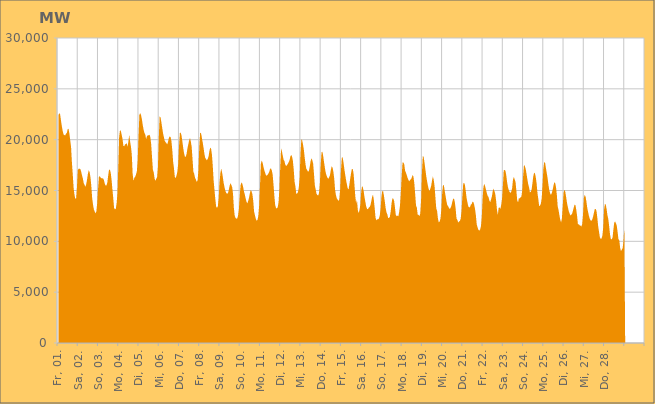
| Category | Series 0 |
|---|---|
|  Fr, 01.  | 22399.033 |
|  Fr, 01.  | 22611.468 |
|  Fr, 01.  | 22499.034 |
|  Fr, 01.  | 21905.06 |
|  Fr, 01.  | 21350.365 |
|  Fr, 01.  | 20880.815 |
|  Fr, 01.  | 20531.171 |
|  Fr, 01.  | 20449.737 |
|  Fr, 01.  | 20410.461 |
|  Fr, 01.  | 20598.987 |
|  Fr, 01.  | 20659.702 |
|  Fr, 01.  | 21032.747 |
|  Fr, 01.  | 21080.836 |
|  Fr, 01.  | 20594.231 |
|  Fr, 01.  | 19942.812 |
|  Fr, 01.  | 19267.961 |
|  Fr, 01.  | 17762.881 |
|  Sa, 02.  | 16591.793 |
|  Sa, 02.  | 15282.178 |
|  Sa, 02.  | 14602.927 |
|  Sa, 02.  | 14180.129 |
|  Sa, 02.  | 14240.453 |
|  Sa, 02.  | 15360.517 |
|  Sa, 02.  | 17010.069 |
|  Sa, 02.  | 17146.067 |
|  Sa, 02.  | 17145.606 |
|  Sa, 02.  | 17114.388 |
|  Sa, 02.  | 16852.625 |
|  Sa, 02.  | 16471.825 |
|  Sa, 02.  | 16177.356 |
|  Sa, 02.  | 15717.177 |
|  Sa, 02.  | 15541.882 |
|  Sa, 02.  | 15359.873 |
|  Sa, 02.  | 15633.692 |
|  Sa, 02.  | 16109.346 |
|  Sa, 02.  | 16650.852 |
|  Sa, 02.  | 17016.553 |
|  Sa, 02.  | 16788.437 |
|  Sa, 02.  | 16309.497 |
|  Sa, 02.  | 15439.524 |
|  Sa, 02.  | 14265.198 |
|  So, 03.  | 13619.63 |
|  So, 03.  | 13150.792 |
|  So, 03.  | 12941.03 |
|  So, 03.  | 12738.193 |
|  So, 03.  | 12961.352 |
|  So, 03.  | 13761.083 |
|  So, 03.  | 15184.934 |
|  So, 03.  | 16328.466 |
|  So, 03.  | 16411.588 |
|  So, 03.  | 16270.473 |
|  So, 03.  | 16199.948 |
|  So, 03.  | 16204.764 |
|  So, 03.  | 16174.838 |
|  So, 03.  | 16008.456 |
|  So, 03.  | 15653.758 |
|  So, 03.  | 15478.343 |
|  So, 03.  | 15504.72 |
|  So, 03.  | 15784.847 |
|  So, 03.  | 16467.389 |
|  So, 03.  | 17032.15 |
|  So, 03.  | 17055.03 |
|  So, 03.  | 16749.838 |
|  So, 03.  | 16054.379 |
|  So, 03.  | 15127.17 |
|  Mo, 04.  | 14258.505 |
|  Mo, 04.  | 13283.716 |
|  Mo, 04.  | 13149.603 |
|  Mo, 04.  | 13186.794 |
|  Mo, 04.  | 13750.439 |
|  Mo, 04.  | 14725.62 |
|  Mo, 04.  | 17343.273 |
|  Mo, 04.  | 20276.248 |
|  Mo, 04.  | 20950.206 |
|  Mo, 04.  | 20842.98 |
|  Mo, 04.  | 20491.643 |
|  Mo, 04.  | 20062.44 |
|  Mo, 04.  | 19406.599 |
|  Mo, 04.  | 19343.089 |
|  Mo, 04.  | 19536.249 |
|  Mo, 04.  | 19569.945 |
|  Mo, 04.  | 19655.745 |
|  Mo, 04.  | 19298.304 |
|  Mo, 04.  | 19854.97 |
|  Mo, 04.  | 20486.493 |
|  Mo, 04.  | 19820.566 |
|  Mo, 04.  | 19313.971 |
|  Mo, 04.  | 18539.929 |
|  Mo, 04.  | 16651.296 |
|  Di, 05.  | 15953.222 |
|  Di, 05.  | 16244.926 |
|  Di, 05.  | 16362.413 |
|  Di, 05.  | 16569.384 |
|  Di, 05.  | 16893.118 |
|  Di, 05.  | 17979.938 |
|  Di, 05.  | 20383.844 |
|  Di, 05.  | 22461.601 |
|  Di, 05.  | 22612.34 |
|  Di, 05.  | 22414.642 |
|  Di, 05.  | 21999.145 |
|  Di, 05.  | 21430.655 |
|  Di, 05.  | 20979.548 |
|  Di, 05.  | 20656.635 |
|  Di, 05.  | 20499.665 |
|  Di, 05.  | 20056.514 |
|  Di, 05.  | 20351.01 |
|  Di, 05.  | 20426.241 |
|  Di, 05.  | 20432.862 |
|  Di, 05.  | 20482.469 |
|  Di, 05.  | 20235.993 |
|  Di, 05.  | 19537.118 |
|  Di, 05.  | 18291.538 |
|  Di, 05.  | 17055.744 |
|  Mi, 06.  | 16792.421 |
|  Mi, 06.  | 16179.504 |
|  Mi, 06.  | 15961.496 |
|  Mi, 06.  | 16153.151 |
|  Mi, 06.  | 16313.219 |
|  Mi, 06.  | 17326.554 |
|  Mi, 06.  | 20161.857 |
|  Mi, 06.  | 22275.907 |
|  Mi, 06.  | 22211.357 |
|  Mi, 06.  | 21757.093 |
|  Mi, 06.  | 21194.512 |
|  Mi, 06.  | 20646.053 |
|  Mi, 06.  | 20268.349 |
|  Mi, 06.  | 19898.55 |
|  Mi, 06.  | 19765.44 |
|  Mi, 06.  | 19663.982 |
|  Mi, 06.  | 19532.734 |
|  Mi, 06.  | 19815.987 |
|  Mi, 06.  | 20168.375 |
|  Mi, 06.  | 20333.433 |
|  Mi, 06.  | 20244.9 |
|  Mi, 06.  | 19859.774 |
|  Mi, 06.  | 18981.743 |
|  Mi, 06.  | 17831.027 |
|  Do, 07.  | 17191.225 |
|  Do, 07.  | 16330.566 |
|  Do, 07.  | 16227.694 |
|  Do, 07.  | 16451.338 |
|  Do, 07.  | 16840.939 |
|  Do, 07.  | 17599.948 |
|  Do, 07.  | 19354.517 |
|  Do, 07.  | 20649.995 |
|  Do, 07.  | 20697.506 |
|  Do, 07.  | 20392.975 |
|  Do, 07.  | 19797.814 |
|  Do, 07.  | 19164.957 |
|  Do, 07.  | 18644.991 |
|  Do, 07.  | 18321.438 |
|  Do, 07.  | 18330.375 |
|  Do, 07.  | 18618.355 |
|  Do, 07.  | 19147.468 |
|  Do, 07.  | 19543.625 |
|  Do, 07.  | 19931.198 |
|  Do, 07.  | 20179.908 |
|  Do, 07.  | 19815.661 |
|  Do, 07.  | 19288.28 |
|  Do, 07.  | 18088.615 |
|  Do, 07.  | 16871.67 |
|  Fr, 08.  | 16636.873 |
|  Fr, 08.  | 16254.698 |
|  Fr, 08.  | 16081.576 |
|  Fr, 08.  | 15845.416 |
|  Fr, 08.  | 16002.348 |
|  Fr, 08.  | 16962.045 |
|  Fr, 08.  | 19265.03 |
|  Fr, 08.  | 20634.935 |
|  Fr, 08.  | 20684.635 |
|  Fr, 08.  | 20233.171 |
|  Fr, 08.  | 19754.713 |
|  Fr, 08.  | 19245.2 |
|  Fr, 08.  | 18655.688 |
|  Fr, 08.  | 18224.634 |
|  Fr, 08.  | 18100.752 |
|  Fr, 08.  | 17973.731 |
|  Fr, 08.  | 18101.147 |
|  Fr, 08.  | 18350.485 |
|  Fr, 08.  | 18855.693 |
|  Fr, 08.  | 19238.471 |
|  Fr, 08.  | 19107.907 |
|  Fr, 08.  | 18539.623 |
|  Fr, 08.  | 17432.048 |
|  Fr, 08.  | 16002.932 |
|  Sa, 09.  | 15103.201 |
|  Sa, 09.  | 14180.098 |
|  Sa, 09.  | 13430.811 |
|  Sa, 09.  | 13297.46 |
|  Sa, 09.  | 13427.414 |
|  Sa, 09.  | 14233.636 |
|  Sa, 09.  | 15756.756 |
|  Sa, 09.  | 16681.082 |
|  Sa, 09.  | 17154.191 |
|  Sa, 09.  | 16805.19 |
|  Sa, 09.  | 16286.008 |
|  Sa, 09.  | 15705.692 |
|  Sa, 09.  | 15295.655 |
|  Sa, 09.  | 14956.647 |
|  Sa, 09.  | 14748.364 |
|  Sa, 09.  | 14700.133 |
|  Sa, 09.  | 14724.355 |
|  Sa, 09.  | 15050.512 |
|  Sa, 09.  | 15467.404 |
|  Sa, 09.  | 15732.505 |
|  Sa, 09.  | 15544.861 |
|  Sa, 09.  | 15329.564 |
|  Sa, 09.  | 14678.593 |
|  Sa, 09.  | 13321.978 |
|  So, 10.  | 12524.441 |
|  So, 10.  | 12297.619 |
|  So, 10.  | 12230.577 |
|  So, 10.  | 12249.294 |
|  So, 10.  | 12534.814 |
|  So, 10.  | 13184.216 |
|  So, 10.  | 14478.22 |
|  So, 10.  | 15518.754 |
|  So, 10.  | 15795.964 |
|  So, 10.  | 15689.548 |
|  So, 10.  | 15344.816 |
|  So, 10.  | 14910.797 |
|  So, 10.  | 14609.558 |
|  So, 10.  | 14219.632 |
|  So, 10.  | 13900.812 |
|  So, 10.  | 13742.199 |
|  So, 10.  | 13981.119 |
|  So, 10.  | 14286.604 |
|  So, 10.  | 14737.929 |
|  So, 10.  | 15054.3 |
|  So, 10.  | 14913.634 |
|  So, 10.  | 14630.492 |
|  So, 10.  | 13976.463 |
|  So, 10.  | 12925.016 |
|  Mo, 11.  | 12576.991 |
|  Mo, 11.  | 12227.617 |
|  Mo, 11.  | 12035.677 |
|  Mo, 11.  | 12094.645 |
|  Mo, 11.  | 12499.144 |
|  Mo, 11.  | 13495 |
|  Mo, 11.  | 15448.89 |
|  Mo, 11.  | 17600.108 |
|  Mo, 11.  | 17959.628 |
|  Mo, 11.  | 17763.802 |
|  Mo, 11.  | 17377.396 |
|  Mo, 11.  | 17027.411 |
|  Mo, 11.  | 16759.957 |
|  Mo, 11.  | 16508.8 |
|  Mo, 11.  | 16448.991 |
|  Mo, 11.  | 16544.359 |
|  Mo, 11.  | 16667.694 |
|  Mo, 11.  | 16855.202 |
|  Mo, 11.  | 17139.374 |
|  Mo, 11.  | 17173.098 |
|  Mo, 11.  | 16973.675 |
|  Mo, 11.  | 16562.666 |
|  Mo, 11.  | 15592.967 |
|  Mo, 11.  | 14498.882 |
|  Di, 12.  | 13572.429 |
|  Di, 12.  | 13282.461 |
|  Di, 12.  | 13239.428 |
|  Di, 12.  | 13357.963 |
|  Di, 12.  | 13835.487 |
|  Di, 12.  | 15138.762 |
|  Di, 12.  | 17287.342 |
|  Di, 12.  | 19119.529 |
|  Di, 12.  | 18859.788 |
|  Di, 12.  | 18428.559 |
|  Di, 12.  | 18030.147 |
|  Di, 12.  | 17889.529 |
|  Di, 12.  | 17537.995 |
|  Di, 12.  | 17416.34 |
|  Di, 12.  | 17505.82 |
|  Di, 12.  | 17608.35 |
|  Di, 12.  | 17785.064 |
|  Di, 12.  | 17967.405 |
|  Di, 12.  | 18343.216 |
|  Di, 12.  | 18508.334 |
|  Di, 12.  | 18328.639 |
|  Di, 12.  | 17911.296 |
|  Di, 12.  | 17063.084 |
|  Di, 12.  | 15857.447 |
|  Mi, 13.  | 15405.021 |
|  Mi, 13.  | 14655.684 |
|  Mi, 13.  | 14708.738 |
|  Mi, 13.  | 14837.816 |
|  Mi, 13.  | 15286.68 |
|  Mi, 13.  | 16259.924 |
|  Mi, 13.  | 18562.607 |
|  Mi, 13.  | 20036.119 |
|  Mi, 13.  | 19933.593 |
|  Mi, 13.  | 19533.41 |
|  Mi, 13.  | 19015.432 |
|  Mi, 13.  | 18240.002 |
|  Mi, 13.  | 17565.868 |
|  Mi, 13.  | 17111.695 |
|  Mi, 13.  | 17013.479 |
|  Mi, 13.  | 16827.296 |
|  Mi, 13.  | 16944.466 |
|  Mi, 13.  | 17354.711 |
|  Mi, 13.  | 17878.038 |
|  Mi, 13.  | 18173.385 |
|  Mi, 13.  | 17988.528 |
|  Mi, 13.  | 17657.829 |
|  Mi, 13.  | 16668.285 |
|  Mi, 13.  | 15528.695 |
|  Do, 14.  | 15103.697 |
|  Do, 14.  | 14680.396 |
|  Do, 14.  | 14559.282 |
|  Do, 14.  | 14500.68 |
|  Do, 14.  | 14762.674 |
|  Do, 14.  | 15696.729 |
|  Do, 14.  | 17560.401 |
|  Do, 14.  | 18764.67 |
|  Do, 14.  | 18808.024 |
|  Do, 14.  | 18354.768 |
|  Do, 14.  | 17759.494 |
|  Do, 14.  | 17215.028 |
|  Do, 14.  | 16723.225 |
|  Do, 14.  | 16458.274 |
|  Do, 14.  | 16246.165 |
|  Do, 14.  | 16153.225 |
|  Do, 14.  | 16310.376 |
|  Do, 14.  | 16508.744 |
|  Do, 14.  | 17023.921 |
|  Do, 14.  | 17387.684 |
|  Do, 14.  | 17266.799 |
|  Do, 14.  | 16848.157 |
|  Do, 14.  | 16191.939 |
|  Do, 14.  | 15109.325 |
|  Fr, 15.  | 14562.921 |
|  Fr, 15.  | 14238.613 |
|  Fr, 15.  | 14110.015 |
|  Fr, 15.  | 13976.249 |
|  Fr, 15.  | 14108.073 |
|  Fr, 15.  | 15052.126 |
|  Fr, 15.  | 16962.816 |
|  Fr, 15.  | 18206.259 |
|  Fr, 15.  | 18278.86 |
|  Fr, 15.  | 17754.449 |
|  Fr, 15.  | 17129.771 |
|  Fr, 15.  | 16561.506 |
|  Fr, 15.  | 16060.03 |
|  Fr, 15.  | 15610.241 |
|  Fr, 15.  | 15210.153 |
|  Fr, 15.  | 15093.719 |
|  Fr, 15.  | 15587.864 |
|  Fr, 15.  | 16177.893 |
|  Fr, 15.  | 16716.471 |
|  Fr, 15.  | 17129.37 |
|  Fr, 15.  | 17116.767 |
|  Fr, 15.  | 16636.842 |
|  Fr, 15.  | 15562.591 |
|  Fr, 15.  | 14436.874 |
|  Sa, 16.  | 13739.745 |
|  Sa, 16.  | 14070.666 |
|  Sa, 16.  | 13075.669 |
|  Sa, 16.  | 12780.313 |
|  Sa, 16.  | 13072.887 |
|  Sa, 16.  | 13611.801 |
|  Sa, 16.  | 14848.12 |
|  Sa, 16.  | 15442.54 |
|  Sa, 16.  | 15296.657 |
|  Sa, 16.  | 14897.964 |
|  Sa, 16.  | 14307.269 |
|  Sa, 16.  | 13849.555 |
|  Sa, 16.  | 13399.665 |
|  Sa, 16.  | 13192.145 |
|  Sa, 16.  | 13157.491 |
|  Sa, 16.  | 13321.984 |
|  Sa, 16.  | 13367.924 |
|  Sa, 16.  | 13560.573 |
|  Sa, 16.  | 13962.682 |
|  Sa, 16.  | 14384.035 |
|  Sa, 16.  | 14598.73 |
|  Sa, 16.  | 14062.078 |
|  Sa, 16.  | 13253.593 |
|  Sa, 16.  | 12321.545 |
|  So, 17.  | 12070.553 |
|  So, 17.  | 12166.711 |
|  So, 17.  | 12174.56 |
|  So, 17.  | 12248.57 |
|  So, 17.  | 12523.326 |
|  So, 17.  | 13196.857 |
|  So, 17.  | 14385.816 |
|  So, 17.  | 14949.981 |
|  So, 17.  | 14928.938 |
|  So, 17.  | 14476.055 |
|  So, 17.  | 13907.059 |
|  So, 17.  | 13251.584 |
|  So, 17.  | 12851.422 |
|  So, 17.  | 12643.209 |
|  So, 17.  | 12291.355 |
|  So, 17.  | 12306.989 |
|  So, 17.  | 12419.453 |
|  So, 17.  | 12945.315 |
|  So, 17.  | 13744.675 |
|  So, 17.  | 14232.367 |
|  So, 17.  | 14199.189 |
|  So, 17.  | 13996.815 |
|  So, 17.  | 13358.565 |
|  So, 17.  | 12612.033 |
|  Mo, 18.  | 12473.069 |
|  Mo, 18.  | 12540.563 |
|  Mo, 18.  | 12443.37 |
|  Mo, 18.  | 12877.647 |
|  Mo, 18.  | 13515.213 |
|  Mo, 18.  | 14763.26 |
|  Mo, 18.  | 16412.316 |
|  Mo, 18.  | 17739.405 |
|  Mo, 18.  | 17761.719 |
|  Mo, 18.  | 17595.908 |
|  Mo, 18.  | 16972.349 |
|  Mo, 18.  | 16755.113 |
|  Mo, 18.  | 16526.532 |
|  Mo, 18.  | 16234.565 |
|  Mo, 18.  | 16051.755 |
|  Mo, 18.  | 15897.851 |
|  Mo, 18.  | 16067.695 |
|  Mo, 18.  | 16091.091 |
|  Mo, 18.  | 16281.327 |
|  Mo, 18.  | 16541.673 |
|  Mo, 18.  | 16337.692 |
|  Mo, 18.  | 15697.339 |
|  Mo, 18.  | 14640.673 |
|  Mo, 18.  | 13530.525 |
|  Di, 19.  | 13305.744 |
|  Di, 19.  | 12607.171 |
|  Di, 19.  | 12602.783 |
|  Di, 19.  | 12488.259 |
|  Di, 19.  | 12715.714 |
|  Di, 19.  | 14028.103 |
|  Di, 19.  | 16742.356 |
|  Di, 19.  | 18367.261 |
|  Di, 19.  | 18326.291 |
|  Di, 19.  | 17788.726 |
|  Di, 19.  | 17141.697 |
|  Di, 19.  | 16486.702 |
|  Di, 19.  | 15968.548 |
|  Di, 19.  | 15507.748 |
|  Di, 19.  | 15162.538 |
|  Di, 19.  | 14932.229 |
|  Di, 19.  | 15179.322 |
|  Di, 19.  | 15475.893 |
|  Di, 19.  | 15994.097 |
|  Di, 19.  | 16379.888 |
|  Di, 19.  | 16055.667 |
|  Di, 19.  | 15428.536 |
|  Di, 19.  | 14315.351 |
|  Di, 19.  | 13244.862 |
|  Mi, 20.  | 12981.411 |
|  Mi, 20.  | 12231.547 |
|  Mi, 20.  | 11860.49 |
|  Mi, 20.  | 11948.746 |
|  Mi, 20.  | 12227.723 |
|  Mi, 20.  | 13133.5 |
|  Mi, 20.  | 14732.649 |
|  Mi, 20.  | 15541.488 |
|  Mi, 20.  | 15511.356 |
|  Mi, 20.  | 15000.287 |
|  Mi, 20.  | 14476.161 |
|  Mi, 20.  | 13995.524 |
|  Mi, 20.  | 13578.598 |
|  Mi, 20.  | 13467.073 |
|  Mi, 20.  | 13306.911 |
|  Mi, 20.  | 13174.099 |
|  Mi, 20.  | 13293.665 |
|  Mi, 20.  | 13517.842 |
|  Mi, 20.  | 13886.549 |
|  Mi, 20.  | 14168.363 |
|  Mi, 20.  | 14218.011 |
|  Mi, 20.  | 13876.896 |
|  Mi, 20.  | 13197.439 |
|  Mi, 20.  | 12251.491 |
|  Do, 21.  | 12102.598 |
|  Do, 21.  | 11844.996 |
|  Do, 21.  | 11950.086 |
|  Do, 21.  | 12008.68 |
|  Do, 21.  | 12232.914 |
|  Do, 21.  | 13050.091 |
|  Do, 21.  | 14474.224 |
|  Do, 21.  | 15682.341 |
|  Do, 21.  | 15755.888 |
|  Do, 21.  | 15546.306 |
|  Do, 21.  | 14927.995 |
|  Do, 21.  | 14234.193 |
|  Do, 21.  | 13820.371 |
|  Do, 21.  | 13430.506 |
|  Do, 21.  | 13352.915 |
|  Do, 21.  | 13351.144 |
|  Do, 21.  | 13630.547 |
|  Do, 21.  | 13660.947 |
|  Do, 21.  | 13904.04 |
|  Do, 21.  | 13860.099 |
|  Do, 21.  | 13590.761 |
|  Do, 21.  | 13162.335 |
|  Do, 21.  | 12547.547 |
|  Do, 21.  | 11654.497 |
|  Fr, 22.  | 11374.93 |
|  Fr, 22.  | 11126.974 |
|  Fr, 22.  | 11057.524 |
|  Fr, 22.  | 11156.706 |
|  Fr, 22.  | 11483.506 |
|  Fr, 22.  | 12445.534 |
|  Fr, 22.  | 14259.578 |
|  Fr, 22.  | 15382.333 |
|  Fr, 22.  | 15647.32 |
|  Fr, 22.  | 15396.663 |
|  Fr, 22.  | 15072.602 |
|  Fr, 22.  | 14727.811 |
|  Fr, 22.  | 14467.022 |
|  Fr, 22.  | 14350.087 |
|  Fr, 22.  | 14000.924 |
|  Fr, 22.  | 13854.34 |
|  Fr, 22.  | 14130.109 |
|  Fr, 22.  | 14437.117 |
|  Fr, 22.  | 14953.637 |
|  Fr, 22.  | 15184.289 |
|  Fr, 22.  | 14937.366 |
|  Fr, 22.  | 14651.867 |
|  Fr, 22.  | 13969.532 |
|  Fr, 22.  | 13097.243 |
|  Sa, 23.  | 12590.516 |
|  Sa, 23.  | 13296.265 |
|  Sa, 23.  | 13339.522 |
|  Sa, 23.  | 13184.255 |
|  Sa, 23.  | 13570.593 |
|  Sa, 23.  | 14188.147 |
|  Sa, 23.  | 15455.03 |
|  Sa, 23.  | 16999.163 |
|  Sa, 23.  | 17009.623 |
|  Sa, 23.  | 16950.699 |
|  Sa, 23.  | 16490.074 |
|  Sa, 23.  | 15815.581 |
|  Sa, 23.  | 15320.688 |
|  Sa, 23.  | 15045.558 |
|  Sa, 23.  | 14846.225 |
|  Sa, 23.  | 14764.506 |
|  Sa, 23.  | 14900.347 |
|  Sa, 23.  | 15247.072 |
|  Sa, 23.  | 16074.557 |
|  Sa, 23.  | 16334.866 |
|  Sa, 23.  | 16081.85 |
|  Sa, 23.  | 15842.14 |
|  Sa, 23.  | 14966.422 |
|  Sa, 23.  | 14016.503 |
|  So, 24.  | 13835.822 |
|  So, 24.  | 14245.877 |
|  So, 24.  | 14219.284 |
|  So, 24.  | 14341.787 |
|  So, 24.  | 14408.587 |
|  So, 24.  | 15054.8 |
|  So, 24.  | 16432.565 |
|  So, 24.  | 17515.353 |
|  So, 24.  | 17408.702 |
|  So, 24.  | 17127.916 |
|  So, 24.  | 16661.704 |
|  So, 24.  | 16112.529 |
|  So, 24.  | 15633.097 |
|  So, 24.  | 15322.611 |
|  So, 24.  | 14820.026 |
|  So, 24.  | 14863.155 |
|  So, 24.  | 15081.291 |
|  So, 24.  | 15679.722 |
|  So, 24.  | 16384.171 |
|  So, 24.  | 16735.733 |
|  So, 24.  | 16692.704 |
|  So, 24.  | 16310.429 |
|  So, 24.  | 15685.69 |
|  So, 24.  | 14745.564 |
|  Mo, 25.  | 14160.403 |
|  Mo, 25.  | 13470.709 |
|  Mo, 25.  | 13518.932 |
|  Mo, 25.  | 13698.998 |
|  Mo, 25.  | 14223.866 |
|  Mo, 25.  | 15520.196 |
|  Mo, 25.  | 17137.13 |
|  Mo, 25.  | 17798.515 |
|  Mo, 25.  | 17753.348 |
|  Mo, 25.  | 17212.441 |
|  Mo, 25.  | 16738.522 |
|  Mo, 25.  | 16213.368 |
|  Mo, 25.  | 15567.079 |
|  Mo, 25.  | 15032.055 |
|  Mo, 25.  | 14732.91 |
|  Mo, 25.  | 14554.968 |
|  Mo, 25.  | 14761.387 |
|  Mo, 25.  | 15071.753 |
|  Mo, 25.  | 15473.21 |
|  Mo, 25.  | 15812.946 |
|  Mo, 25.  | 15738.308 |
|  Mo, 25.  | 15328.356 |
|  Mo, 25.  | 14546.79 |
|  Mo, 25.  | 13426.402 |
|  Di, 26.  | 13087.314 |
|  Di, 26.  | 12567.37 |
|  Di, 26.  | 12146.896 |
|  Di, 26.  | 11842.017 |
|  Di, 26.  | 12281.856 |
|  Di, 26.  | 13543.928 |
|  Di, 26.  | 14787.541 |
|  Di, 26.  | 15087.971 |
|  Di, 26.  | 14869.113 |
|  Di, 26.  | 14350.432 |
|  Di, 26.  | 13803.521 |
|  Di, 26.  | 13379.293 |
|  Di, 26.  | 13000.122 |
|  Di, 26.  | 12763.189 |
|  Di, 26.  | 12545.479 |
|  Di, 26.  | 12607.608 |
|  Di, 26.  | 12713.52 |
|  Di, 26.  | 12984.214 |
|  Di, 26.  | 13332.465 |
|  Di, 26.  | 13602.517 |
|  Di, 26.  | 13559.661 |
|  Di, 26.  | 13111.935 |
|  Di, 26.  | 12486.835 |
|  Di, 26.  | 11656.231 |
|  Mi, 27.  | 11695.396 |
|  Mi, 27.  | 11570.195 |
|  Mi, 27.  | 11561.538 |
|  Mi, 27.  | 11453.528 |
|  Mi, 27.  | 11693.88 |
|  Mi, 27.  | 12603.929 |
|  Mi, 27.  | 14251.569 |
|  Mi, 27.  | 14579.513 |
|  Mi, 27.  | 14411.771 |
|  Mi, 27.  | 13932.223 |
|  Mi, 27.  | 13305.483 |
|  Mi, 27.  | 12894.071 |
|  Mi, 27.  | 12512.498 |
|  Mi, 27.  | 12215.122 |
|  Mi, 27.  | 12052.978 |
|  Mi, 27.  | 12026.116 |
|  Mi, 27.  | 12153.329 |
|  Mi, 27.  | 12446.027 |
|  Mi, 27.  | 12827.055 |
|  Mi, 27.  | 13192.086 |
|  Mi, 27.  | 13191.965 |
|  Mi, 27.  | 12982.163 |
|  Mi, 27.  | 12291.359 |
|  Mi, 27.  | 11480.659 |
|  Do, 28.  | 10936.052 |
|  Do, 28.  | 10398.408 |
|  Do, 28.  | 10240.792 |
|  Do, 28.  | 10282.981 |
|  Do, 28.  | 10579.81 |
|  Do, 28.  | 11407.948 |
|  Do, 28.  | 13128.897 |
|  Do, 28.  | 13692.208 |
|  Do, 28.  | 13609.759 |
|  Do, 28.  | 13153.018 |
|  Do, 28.  | 12554.99 |
|  Do, 28.  | 12180.412 |
|  Do, 28.  | 11495.513 |
|  Do, 28.  | 10699.296 |
|  Do, 28.  | 10234.597 |
|  Do, 28.  | 10182.381 |
|  Do, 28.  | 10350.812 |
|  Do, 28.  | 11137.207 |
|  Do, 28.  | 11823.411 |
|  Do, 28.  | 11961.612 |
|  Do, 28.  | 11780.118 |
|  Do, 28.  | 11547.145 |
|  Do, 28.  | 10933.323 |
|  Do, 28.  | 10217.995 |
|  Fr, 01.  | 10113.8 |
|  Fr, 01.  | 9366.948 |
|  Fr, 01.  | 9037.037 |
|  Fr, 01.  | 9172.094 |
|  Fr, 01.  | 9334.794 |
|  Fr, 01.  | 10015.668 |
|    | 11382.648 |
|    | 0 |
|    | 0 |
|    | 0 |
|    | 0 |
|    | 0 |
|    | 0 |
|    | 0 |
|    | 0 |
|    | 0 |
|    | 0 |
|    | 0 |
|    | 0 |
|    | 0 |
|    | 0 |
|    | 0 |
|    | 0 |
|    | 0 |
|    | 0 |
|    | 0 |
|    | 0 |
|    | 0 |
|    | 0 |
|    | 0 |
|    | 0 |